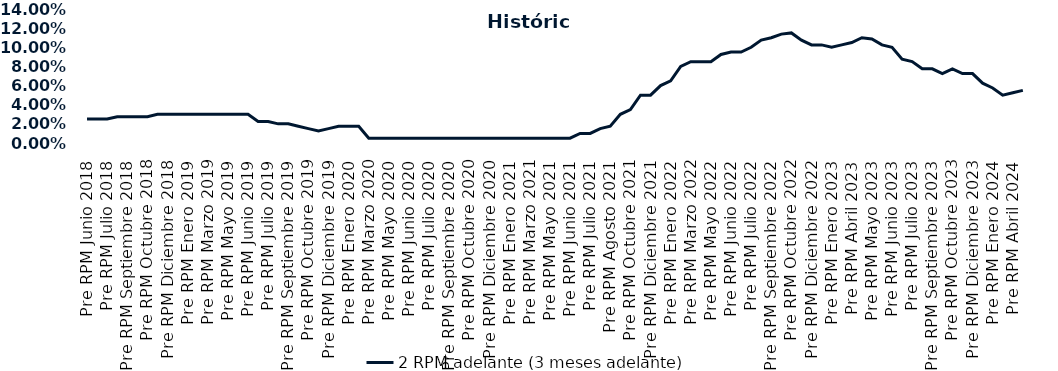
| Category | 2 RPM adelante (3 meses adelante) |
|---|---|
| Pre RPM Junio 2018 | 0.025 |
| Post RPM Junio 2018 | 0.025 |
| Pre RPM Julio 2018 | 0.025 |
| Post RPM Julio 2018 | 0.028 |
| Pre RPM Septiembre 2018 | 0.028 |
| Post RPM Septiembre 2018 | 0.028 |
| Pre RPM Octubre 2018 | 0.028 |
| Post RPM Octubre 2018 | 0.03 |
| Pre RPM Diciembre 2018 | 0.03 |
| Post RPM Diciembre 2018 | 0.03 |
| Pre RPM Enero 2019 | 0.03 |
| Post RPM Enero 2019 | 0.03 |
| Pre RPM Marzo 2019 | 0.03 |
| Post RPM Marzo 2019 | 0.03 |
| Pre RPM Mayo 2019 | 0.03 |
| Post RPM Mayo 2019 | 0.03 |
| Pre RPM Junio 2019 | 0.03 |
| Post RPM Junio 2019 | 0.022 |
| Pre RPM Julio 2019 | 0.022 |
| Post RPM Julio 2019 | 0.02 |
| Pre RPM Septiembre 2019 | 0.02 |
| Post RPM Septiembre 2019 | 0.018 |
| Pre RPM Octubre 2019 | 0.015 |
| Post RPM Octubre 2019 | 0.012 |
| Pre RPM Diciembre 2019 | 0.015 |
| Post RPM Diciembre 2019 | 0.018 |
| Pre RPM Enero 2020 | 0.018 |
| Post RPM Enero 2020 | 0.018 |
| Pre RPM Marzo 2020 | 0.005 |
| Post RPM Marzo 2020 | 0.005 |
| Pre RPM Mayo 2020 | 0.005 |
| Post RPM Mayo 2020 | 0.005 |
| Pre RPM Junio 2020 | 0.005 |
| Post RPM Junio 2020 | 0.005 |
| Pre RPM Julio 2020 | 0.005 |
| Post RPM Julio 2020 | 0.005 |
| Pre RPM Septiembre 2020 | 0.005 |
| Post RPM Septiembre 2020 | 0.005 |
| Pre RPM Octubre 2020 | 0.005 |
| Post RPM Octubre 2020 | 0.005 |
| Pre RPM Diciembre 2020 | 0.005 |
| Post RPM Diciembre 2020 | 0.005 |
| Pre RPM Enero 2021 | 0.005 |
| Post RPM Enero 2021 | 0.005 |
| Pre RPM Marzo 2021 | 0.005 |
| Post RPM Marzo 2021 | 0.005 |
| Pre RPM Mayo 2021 | 0.005 |
| Post RPM Mayo 2021 | 0.005 |
| Pre RPM Junio 2021 | 0.005 |
| Post RPM Junio 2021 | 0.01 |
| Pre RPM Julio 2021 | 0.01 |
| Post RPM Julio 2021 | 0.015 |
| Pre RPM Agosto 2021 | 0.018 |
| Post RPM Agosto 2021 | 0.03 |
| Pre RPM Octubre 2021 | 0.035 |
| Post RPM Octubre 2021 | 0.05 |
| Pre RPM Diciembre 2021 | 0.05 |
| Post RPM Diciembre 2021 | 0.06 |
| Pre RPM Enero 2022 | 0.065 |
| Post RPM Enero 2022 | 0.08 |
| Pre RPM Marzo 2022 | 0.085 |
| Post RPM Marzo 2022 | 0.085 |
| Pre RPM Mayo 2022 | 0.085 |
| Post RPM Mayo 2022 | 0.092 |
| Pre RPM Junio 2022 | 0.095 |
| Post RPM Junio 2022 | 0.095 |
| Pre RPM Julio 2022 | 0.1 |
| Post RPM Julio 2022 | 0.108 |
| Pre RPM Septiembre 2022 | 0.11 |
| Post RPM Septiembre 2022 | 0.114 |
| Pre RPM Octubre 2022 | 0.115 |
| Post RPM Octubre 2022 | 0.108 |
| Pre RPM Diciembre 2022 | 0.102 |
| Post RPM Diciembre 2022 | 0.102 |
| Pre RPM Enero 2023 | 0.1 |
| Post RPM Enero 2023 | 0.102 |
| Pre RPM Abril 2023 | 0.105 |
| Post RPM Abril 2023 | 0.11 |
| Pre RPM Mayo 2023 | 0.109 |
| Post RPM Mayo 2023 | 0.102 |
| Pre RPM Junio 2023 | 0.1 |
| Post RPM Junio 2023 | 0.088 |
| Pre RPM Julio 2023 | 0.085 |
| Post RPM Julio 2023 | 0.078 |
| Pre RPM Septiembre 2023 | 0.078 |
| Post RPM Septiembre 2023 | 0.072 |
| Pre RPM Octubre 2023 | 0.078 |
| Post RPM Octubre 2023 | 0.072 |
| Pre RPM Diciembre 2023 | 0.072 |
| Post RPM Diciembre 2023 | 0.062 |
| Pre RPM Enero 2024 | 0.058 |
| Post RPM Enero 2024 | 0.05 |
| Pre RPM Abril 2024 | 0.052 |
| Post RPM Abril 2024 | 0.055 |